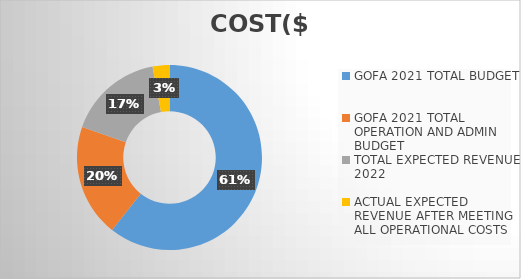
| Category | COST($) |
|---|---|
| GOFA 2021 TOTAL BUDGET | 155355 |
| GOFA 2021 TOTAL OPERATION AND ADMIN BUDGET | 50355 |
| TOTAL EXPECTED REVENUE 2022 | 42821 |
| ACTUAL EXPECTED REVENUE AFTER MEETING ALL OPERATIONAL COSTS | 7534 |